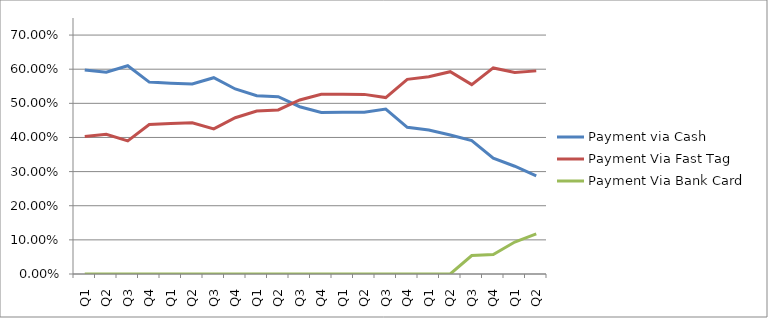
| Category | Payment via Cash | Payment Via Fast Tag | Payment Via Bank Card  |
|---|---|---|---|
| Q1 | 0.598 | 0.402 | 0 |
| Q2 | 0.591 | 0.409 | 0 |
| Q3 | 0.61 | 0.39 | 0 |
| Q4 | 0.562 | 0.438 | 0 |
| Q1 | 0.559 | 0.441 | 0 |
| Q2 | 0.557 | 0.443 | 0 |
| Q3 | 0.575 | 0.425 | 0 |
| Q4 | 0.542 | 0.458 | 0 |
| Q1 | 0.522 | 0.478 | 0 |
| Q2 | 0.519 | 0.481 | 0 |
| Q3 | 0.49 | 0.51 | 0 |
| Q4 | 0.473 | 0.527 | 0 |
| Q1 | 0.474 | 0.526 | 0 |
| Q2 | 0.474 | 0.526 | 0 |
| Q3 | 0.483 | 0.517 | 0 |
| Q4 | 0.43 | 0.57 | 0 |
| Q1 | 0.422 | 0.578 | 0 |
| Q2 | 0.407 | 0.593 | 0 |
| Q3 | 0.391 | 0.555 | 0.054 |
| Q4 | 0.339 | 0.604 | 0.057 |
| Q1 | 0.316 | 0.591 | 0.094 |
| Q2 | 0.288 | 0.595 | 0.117 |